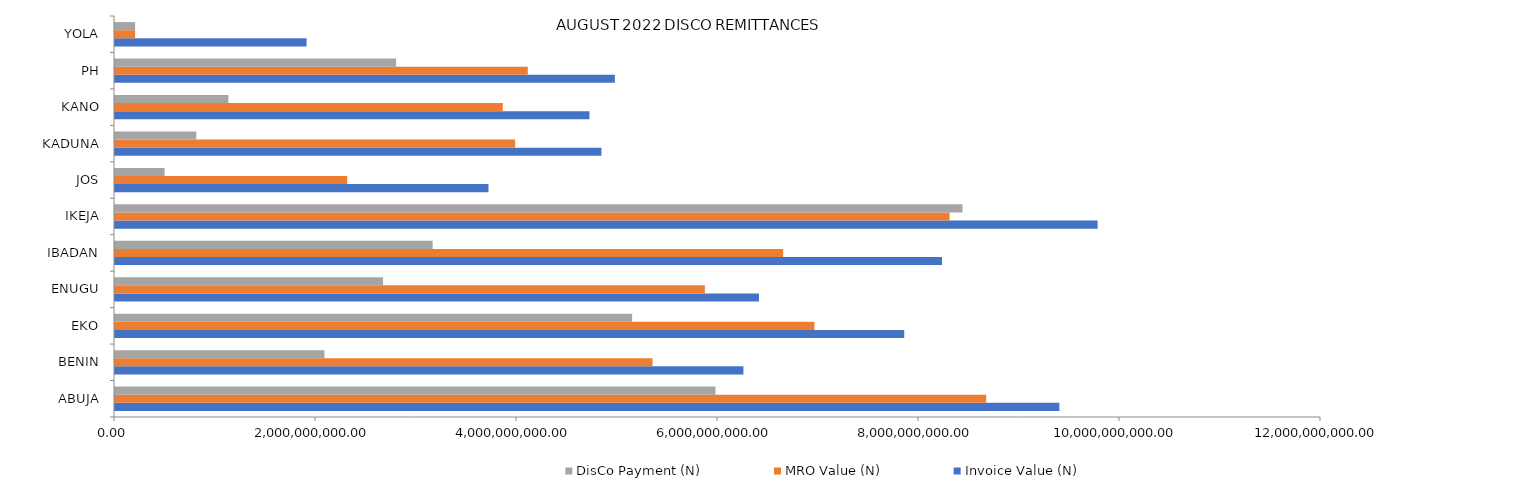
| Category | Invoice Value (N) | MRO Value (N) | DisCo Payment (N) |
|---|---|---|---|
| ABUJA | 9396792493.32 | 8668541075.088 | 5975153992.78 |
| BENIN | 6252841985.47 | 5348681034.371 | 2084173668.24 |
| EKO | 7852846475.15 | 6959192546.278 | 5145555358.42 |
| ENUGU | 6407803996.18 | 5869548460.501 | 2667136203.5 |
| IBADAN | 8228922551.54 | 6648146529.389 | 3160382256.14 |
| IKEJA | 9777517202.77 | 8304045360.313 | 8432542442.75 |
| JOS | 3715925710.53 | 2310191014.237 | 493460997.56 |
| KADUNA | 4840153042.51 | 3981509892.769 | 808527118.88 |
| KANO | 4720898648.37 | 3858390465.313 | 1128632945.73 |
| PH | 4973854209.34 | 4107408806.073 | 2797354754.38 |
| YOLA | 1906115467.86 | 200142124.125 | 200142124.13 |